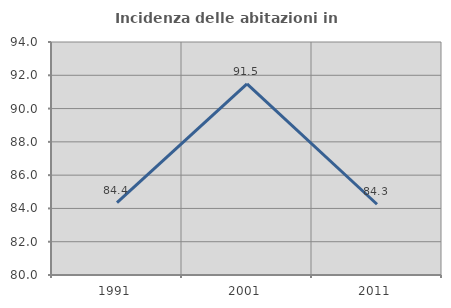
| Category | Incidenza delle abitazioni in proprietà  |
|---|---|
| 1991.0 | 84.354 |
| 2001.0 | 91.489 |
| 2011.0 | 84.252 |